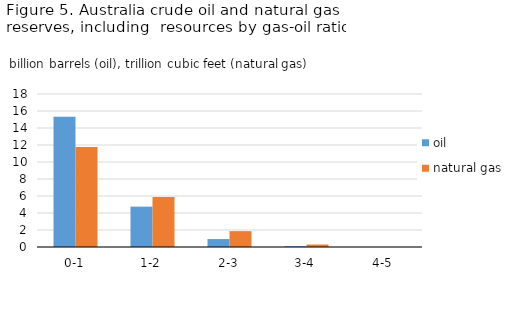
| Category | oil | natural gas |
|---|---|---|
| 0-1 | 15.311 | 11.779 |
| 1-2 | 4.75 | 5.884 |
| 2-3 | 0.932 | 1.865 |
| 3-4 | 0.091 | 0.295 |
| 4-5 | 0 | 0 |